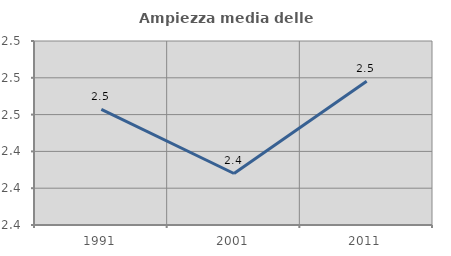
| Category | Ampiezza media delle famiglie |
|---|---|
| 1991.0 | 2.463 |
| 2001.0 | 2.428 |
| 2011.0 | 2.478 |